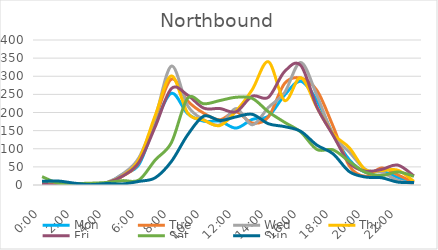
| Category | Mon | Tue | Wed | Thu | Fri | Sat | Sun |
|---|---|---|---|---|---|---|---|
| 0.0 | 5 | 3 | 2 | 3 | 2 | 23 | 10 |
| 0.041667 | 3 | 2 | 0 | 1 | 0 | 5 | 11 |
| 0.083333 | 2 | 2 | 0 | 1 | 2 | 4 | 5 |
| 0.125 | 1 | 0 | 2 | 1 | 0 | 5 | 1 |
| 0.166667 | 5 | 6 | 7 | 6 | 6 | 7 | 4 |
| 0.208333 | 30 | 25 | 31 | 26 | 25 | 12 | 3 |
| 0.25 | 57 | 63 | 76 | 71 | 63 | 14 | 10 |
| 0.291667 | 169 | 184 | 187 | 192 | 161 | 69 | 20 |
| 0.333333 | 253 | 292 | 328 | 301 | 266 | 117 | 65 |
| 0.375 | 197 | 232 | 219 | 199 | 248 | 239 | 138 |
| 0.416667 | 176 | 198 | 180 | 179 | 212 | 224 | 190 |
| 0.458333 | 176 | 180 | 166 | 164 | 211 | 233 | 178 |
| 0.5 | 157 | 202 | 211 | 204 | 202 | 242 | 188 |
| 0.541667 | 181 | 171 | 166 | 263 | 245 | 239 | 195 |
| 0.5833333333333334 | 190 | 188 | 214 | 340 | 242 | 202 | 169 |
| 0.625 | 248 | 280 | 255 | 233 | 313 | 173 | 161 |
| 0.666667 | 286 | 295 | 338 | 296 | 330 | 146 | 148 |
| 0.708333 | 233 | 261 | 247 | 214 | 215 | 98 | 110 |
| 0.75 | 140 | 162 | 139 | 141 | 137 | 97 | 86 |
| 0.791667 | 70 | 53 | 91 | 103 | 61 | 65 | 37 |
| 0.833333 | 35 | 24 | 43 | 42 | 38 | 35 | 22 |
| 0.875 | 38 | 47 | 35 | 40 | 43 | 26 | 20 |
| 0.916667 | 21 | 28 | 13 | 41 | 55 | 36 | 8 |
| 0.958333 | 5 | 7 | 3 | 10 | 25 | 24 | 7 |